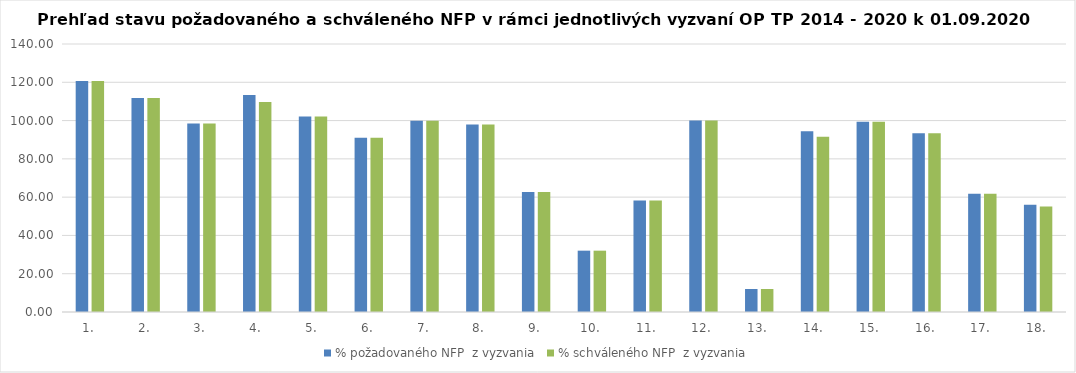
| Category | % požadovaného NFP  z vyzvania | % schváleného NFP  z vyzvania |
|---|---|---|
| 1. | 120.662 | 120.662 |
| 2. | 111.83 | 111.83 |
| 3. | 98.465 | 98.465 |
| 4. | 113.295 | 109.758 |
| 5. | 102.19 | 102.19 |
| 6. | 91.016 | 91.016 |
| 7. | 99.954 | 99.954 |
| 8. | 97.989 | 97.989 |
| 9. | 62.721 | 62.721 |
| 10. | 32.038 | 32.038 |
| 11. | 58.283 | 58.283 |
| 12. | 99.995 | 99.995 |
| 13. | 12.008 | 12.008 |
| 14. | 94.372 | 91.488 |
| 15. | 99.394 | 99.394 |
| 16. | 93.316 | 93.316 |
| 17. | 61.754 | 61.754 |
| 18. | 56.052 | 55.063 |